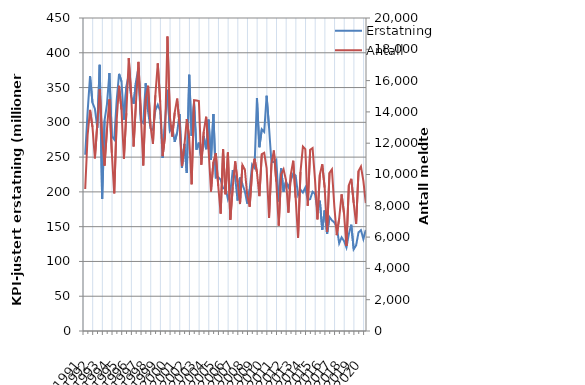
| Category | Erstatning |
|---|---|
| 1991.0 | 253.469 |
| nan | 315.36 |
| nan | 366.519 |
| nan | 328.269 |
| 1992.0 | 319.552 |
| nan | 291.981 |
| nan | 382.641 |
| nan | 189.775 |
| 1993.0 | 302.742 |
| nan | 326.193 |
| nan | 370.855 |
| nan | 280.025 |
| 1994.0 | 275.259 |
| nan | 331.438 |
| nan | 369.692 |
| nan | 358.663 |
| 1995.0 | 303.678 |
| nan | 351.299 |
| nan | 368.914 |
| nan | 337.816 |
| 1996.0 | 326.588 |
| nan | 358.519 |
| nan | 378.266 |
| nan | 302.415 |
| 1997.0 | 298.989 |
| nan | 356.113 |
| nan | 315.206 |
| nan | 291.396 |
| 1998.0 | 289.223 |
| nan | 317.273 |
| nan | 325.337 |
| nan | 316.584 |
| 1999.0 | 248.708 |
| nan | 301.782 |
| nan | 346.828 |
| nan | 287.664 |
| 2000.0 | 293.228 |
| nan | 271.936 |
| nan | 285.248 |
| nan | 311.846 |
| 2001.0 | 234.505 |
| nan | 268.968 |
| nan | 227.131 |
| nan | 368.386 |
| 2002.0 | 280.478 |
| nan | 328.826 |
| nan | 260.77 |
| nan | 270.739 |
| 2003.0 | 247.365 |
| nan | 280.296 |
| nan | 261.363 |
| nan | 303.899 |
| 2004.0 | 246.119 |
| nan | 312.001 |
| nan | 220.435 |
| nan | 221.355 |
| 2005.0 | 217.579 |
| nan | 205.064 |
| nan | 205.915 |
| nan | 189.628 |
| 2006.0 | 200.078 |
| nan | 231.376 |
| nan | 220.674 |
| nan | 187.581 |
| 2007.0 | 220.694 |
| nan | 210.821 |
| nan | 201.064 |
| nan | 183.119 |
| 2008.0 | 203.451 |
| nan | 239.218 |
| nan | 234.438 |
| nan | 334.908 |
| 2009.0 | 264.21 |
| nan | 289.974 |
| nan | 286.344 |
| nan | 338.202 |
| 2010.0 | 292.603 |
| nan | 242.276 |
| nan | 243.27 |
| nan | 246.171 |
| 2011.0 | 186.198 |
| nan | 233.898 |
| nan | 200.278 |
| nan | 214.975 |
| 2012.0 | 206.705 |
| nan | 216.668 |
| nan | 226.437 |
| nan | 223.463 |
| 2013.0 | 195.495 |
| nan | 203.199 |
| nan | 199.023 |
| nan | 206.2 |
| 2014.0 | 188.402 |
| nan | 189.607 |
| nan | 200.172 |
| nan | 197.056 |
| 2015.0 | 173.901 |
| nan | 187.368 |
| nan | 145.441 |
| nan | 173.337 |
| 2016.0 | 139.594 |
| nan | 163.833 |
| nan | 159.014 |
| nan | 156.137 |
| 2017.0 | 149.352 |
| nan | 126.055 |
| nan | 134.611 |
| nan | 129.438 |
| 2018.0 | 120.035 |
| nan | 139.312 |
| nan | 152.844 |
| nan | 117.524 |
| 2019.0 | 123.081 |
| nan | 141.817 |
| nan | 144.981 |
| nan | 132.183 |
| 2020.0 | 145.263 |